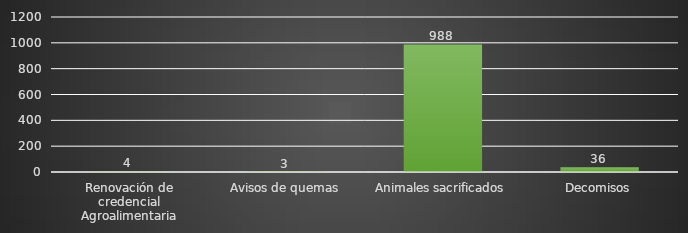
| Category | INDICADOR  |
|---|---|
| Renovación de credencial Agroalimentaria | 4 |
| Avisos de quemas | 3 |
| Animales sacrificados | 988 |
| Decomisos | 36 |